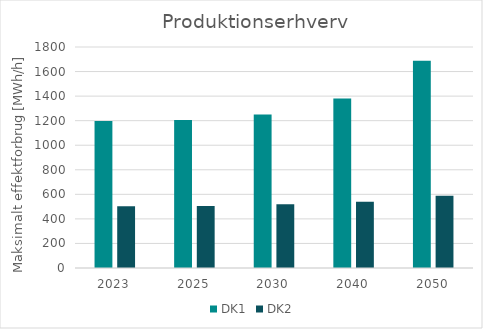
| Category | DK1 | DK2 |
|---|---|---|
| 2023.0 | 1196.594 | 502.594 |
| 2025.0 | 1205.146 | 504.086 |
| 2030.0 | 1250.63 | 518.231 |
| 2040.0 | 1380.242 | 538.977 |
| 2050.0 | 1688.9 | 587.45 |